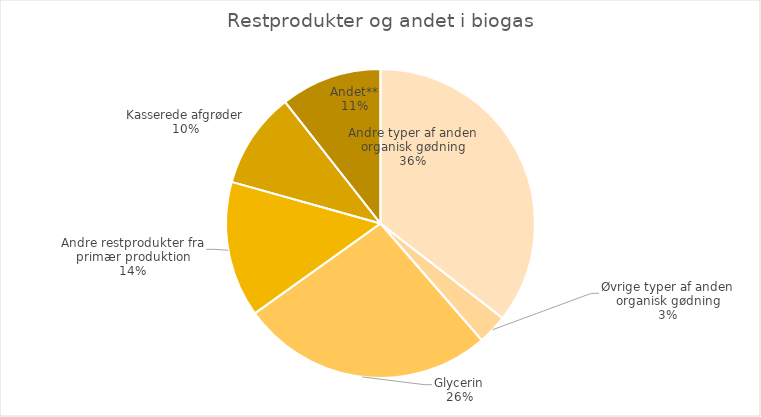
| Category | Series 0 |
|---|---|
| Andre typer af anden organisk gødning | 254570 |
| Øvrige typer af anden organisk gødning | 22476 |
| Glycerin | 189941.22 |
| Andre restprodukter fra primær produktion | 102037.24 |
| Kasserede afgrøder | 72165.34 |
| Andet** | 76006.27 |